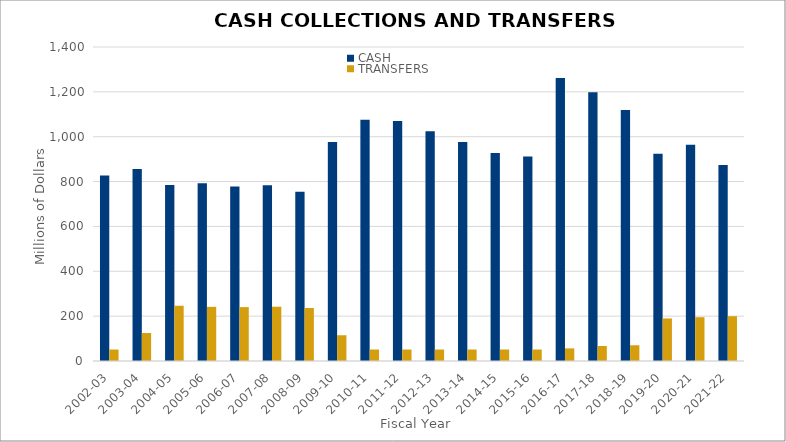
| Category | CASH | TRANSFERS |
|---|---|---|
| 2002-03 | 826.742 | 51.215 |
| 2003-04 | 856.442 | 124.955 |
| 2004-05 | 784.371 | 246.364 |
| 2005-06 | 792.124 | 241.446 |
| 2006-07 | 778.582 | 240.212 |
| 2007-08 | 784.055 | 242.039 |
| 2008-09 | 754.159 | 236.414 |
| 2009-10 | 976.056 | 114.881 |
| 2010-11 | 1075.366 | 51.215 |
| 2011-12 | 1069.907 | 51.215 |
| 2012-13 | 1024.081 | 51.215 |
| 2013-14 | 976.908 | 51.215 |
| 2014-15 | 927.205 | 51.215 |
| 2015-16 | 911.512 | 51.215 |
| 2016-17 | 1261.572 | 56.215 |
| 2017-18 | 1198.252 | 66.815 |
| 2018-19 | 1118.764 | 70.115 |
| 2019-20 | 924.341 | 189.72 |
| 2020-21 | 964.201 | 195.274 |
| 2021-22 | 874.065 | 199.768 |